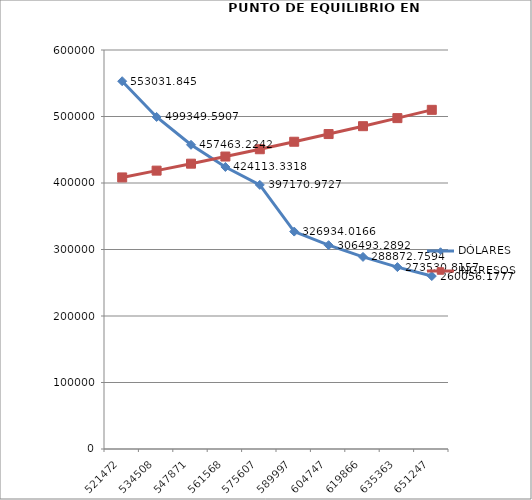
| Category | DÓLARES | INGRESOS |
|---|---|---|
| 521472.0 | 553031.845 | 408379.166 |
| 534508.0 | 499349.591 | 418588.645 |
| 547871.0 | 457463.224 | 429053.361 |
| 561568.0 | 424113.332 | 439779.695 |
| 575607.0 | 397170.973 | 450774.188 |
| 589997.0 | 326934.017 | 462043.543 |
| 604747.0 | 306493.289 | 473594.631 |
| 619866.0 | 288872.759 | 485434.497 |
| 635363.0 | 273530.816 | 497570.359 |
| 651247.0 | 260056.178 | 510009.618 |